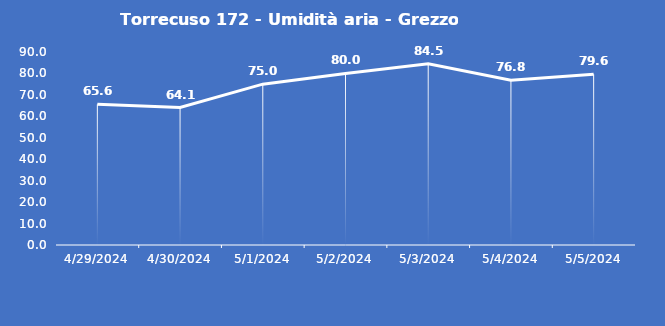
| Category | Torrecuso 172 - Umidità aria - Grezzo (%) |
|---|---|
| 4/29/24 | 65.6 |
| 4/30/24 | 64.1 |
| 5/1/24 | 75 |
| 5/2/24 | 80 |
| 5/3/24 | 84.5 |
| 5/4/24 | 76.8 |
| 5/5/24 | 79.6 |